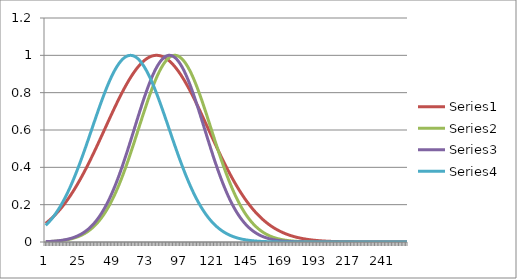
| Category | Series 1 | Series 2 | Series 3 | Series 4 |
|---|---|---|---|---|
| 0 | 0.1 | 0.002 | 0.002 | 0.089 |
| 1 | 0.106 | 0.002 | 0.002 | 0.097 |
| 2 | 0.112 | 0.002 | 0.003 | 0.105 |
| 3 | 0.119 | 0.003 | 0.003 | 0.113 |
| 4 | 0.126 | 0.003 | 0.003 | 0.122 |
| 5 | 0.133 | 0.004 | 0.004 | 0.131 |
| 6 | 0.14 | 0.004 | 0.005 | 0.141 |
| 7 | 0.148 | 0.005 | 0.005 | 0.152 |
| 8 | 0.156 | 0.005 | 0.006 | 0.163 |
| 9 | 0.165 | 0.006 | 0.007 | 0.174 |
| 10 | 0.173 | 0.007 | 0.008 | 0.187 |
| 11 | 0.182 | 0.007 | 0.009 | 0.199 |
| 12 | 0.192 | 0.008 | 0.01 | 0.213 |
| 13 | 0.201 | 0.01 | 0.011 | 0.227 |
| 14 | 0.211 | 0.011 | 0.012 | 0.241 |
| 15 | 0.222 | 0.012 | 0.014 | 0.257 |
| 16 | 0.232 | 0.013 | 0.016 | 0.272 |
| 17 | 0.244 | 0.015 | 0.018 | 0.289 |
| 18 | 0.255 | 0.017 | 0.02 | 0.306 |
| 19 | 0.267 | 0.019 | 0.022 | 0.323 |
| 20 | 0.279 | 0.021 | 0.025 | 0.341 |
| 21 | 0.291 | 0.023 | 0.028 | 0.36 |
| 22 | 0.304 | 0.026 | 0.031 | 0.379 |
| 23 | 0.317 | 0.029 | 0.034 | 0.399 |
| 24 | 0.33 | 0.032 | 0.038 | 0.419 |
| 25 | 0.343 | 0.035 | 0.042 | 0.439 |
| 26 | 0.357 | 0.039 | 0.046 | 0.46 |
| 27 | 0.371 | 0.043 | 0.051 | 0.481 |
| 28 | 0.386 | 0.048 | 0.056 | 0.503 |
| 29 | 0.401 | 0.052 | 0.062 | 0.524 |
| 30 | 0.415 | 0.058 | 0.068 | 0.546 |
| 31 | 0.431 | 0.063 | 0.075 | 0.568 |
| 32 | 0.446 | 0.069 | 0.082 | 0.59 |
| 33 | 0.462 | 0.075 | 0.09 | 0.613 |
| 34 | 0.477 | 0.082 | 0.098 | 0.635 |
| 35 | 0.493 | 0.09 | 0.107 | 0.657 |
| 36 | 0.51 | 0.098 | 0.116 | 0.679 |
| 37 | 0.526 | 0.106 | 0.126 | 0.701 |
| 38 | 0.542 | 0.115 | 0.137 | 0.722 |
| 39 | 0.559 | 0.125 | 0.148 | 0.743 |
| 40 | 0.575 | 0.135 | 0.16 | 0.764 |
| 41 | 0.592 | 0.146 | 0.172 | 0.784 |
| 42 | 0.608 | 0.157 | 0.186 | 0.804 |
| 43 | 0.625 | 0.17 | 0.2 | 0.823 |
| 44 | 0.641 | 0.182 | 0.215 | 0.842 |
| 45 | 0.658 | 0.196 | 0.23 | 0.859 |
| 46 | 0.674 | 0.21 | 0.246 | 0.876 |
| 47 | 0.691 | 0.225 | 0.263 | 0.892 |
| 48 | 0.707 | 0.24 | 0.281 | 0.907 |
| 49 | 0.723 | 0.256 | 0.299 | 0.922 |
| 50 | 0.739 | 0.273 | 0.318 | 0.935 |
| 51 | 0.754 | 0.29 | 0.338 | 0.947 |
| 52 | 0.77 | 0.308 | 0.359 | 0.958 |
| 53 | 0.785 | 0.327 | 0.379 | 0.967 |
| 54 | 0.799 | 0.346 | 0.401 | 0.976 |
| 55 | 0.814 | 0.366 | 0.423 | 0.983 |
| 56 | 0.828 | 0.387 | 0.446 | 0.989 |
| 57 | 0.842 | 0.408 | 0.469 | 0.994 |
| 58 | 0.855 | 0.429 | 0.492 | 0.997 |
| 59 | 0.868 | 0.451 | 0.516 | 0.999 |
| 60 | 0.88 | 0.474 | 0.54 | 1 |
| 61 | 0.892 | 0.496 | 0.564 | 0.999 |
| 62 | 0.904 | 0.519 | 0.588 | 0.997 |
| 63 | 0.914 | 0.543 | 0.613 | 0.994 |
| 64 | 0.925 | 0.566 | 0.637 | 0.99 |
| 65 | 0.934 | 0.59 | 0.661 | 0.984 |
| 66 | 0.944 | 0.613 | 0.685 | 0.976 |
| 67 | 0.952 | 0.637 | 0.709 | 0.968 |
| 68 | 0.96 | 0.66 | 0.733 | 0.958 |
| 69 | 0.967 | 0.684 | 0.756 | 0.948 |
| 70 | 0.974 | 0.707 | 0.778 | 0.936 |
| 71 | 0.979 | 0.729 | 0.8 | 0.923 |
| 72 | 0.985 | 0.752 | 0.821 | 0.909 |
| 73 | 0.989 | 0.774 | 0.842 | 0.893 |
| 74 | 0.993 | 0.795 | 0.861 | 0.878 |
| 75 | 0.996 | 0.815 | 0.879 | 0.861 |
| 76 | 0.998 | 0.835 | 0.897 | 0.843 |
| 77 | 0.999 | 0.854 | 0.913 | 0.825 |
| 78 | 1 | 0.873 | 0.928 | 0.806 |
| 79 | 1 | 0.89 | 0.942 | 0.786 |
| 80 | 0.999 | 0.906 | 0.954 | 0.766 |
| 81 | 0.998 | 0.921 | 0.965 | 0.745 |
| 82 | 0.995 | 0.935 | 0.975 | 0.724 |
| 83 | 0.992 | 0.948 | 0.983 | 0.702 |
| 84 | 0.989 | 0.959 | 0.99 | 0.681 |
| 85 | 0.984 | 0.969 | 0.995 | 0.659 |
| 86 | 0.979 | 0.978 | 0.998 | 0.636 |
| 87 | 0.973 | 0.985 | 1 | 0.614 |
| 88 | 0.967 | 0.991 | 1 | 0.592 |
| 89 | 0.96 | 0.996 | 0.999 | 0.57 |
| 90 | 0.952 | 0.999 | 0.995 | 0.548 |
| 91 | 0.943 | 1 | 0.991 | 0.526 |
| 92 | 0.934 | 1 | 0.985 | 0.504 |
| 93 | 0.924 | 0.998 | 0.977 | 0.483 |
| 94 | 0.914 | 0.995 | 0.968 | 0.462 |
| 95 | 0.903 | 0.99 | 0.957 | 0.441 |
| 96 | 0.892 | 0.984 | 0.945 | 0.42 |
| 97 | 0.88 | 0.977 | 0.931 | 0.4 |
| 98 | 0.867 | 0.968 | 0.916 | 0.381 |
| 99 | 0.854 | 0.958 | 0.9 | 0.361 |
| 100 | 0.841 | 0.946 | 0.883 | 0.343 |
| 101 | 0.827 | 0.933 | 0.865 | 0.325 |
| 102 | 0.813 | 0.919 | 0.846 | 0.307 |
| 103 | 0.799 | 0.904 | 0.826 | 0.29 |
| 104 | 0.784 | 0.887 | 0.805 | 0.274 |
| 105 | 0.769 | 0.87 | 0.783 | 0.258 |
| 106 | 0.753 | 0.851 | 0.761 | 0.243 |
| 107 | 0.738 | 0.832 | 0.738 | 0.228 |
| 108 | 0.722 | 0.812 | 0.714 | 0.214 |
| 109 | 0.706 | 0.791 | 0.691 | 0.2 |
| 110 | 0.69 | 0.77 | 0.666 | 0.188 |
| 111 | 0.674 | 0.748 | 0.642 | 0.175 |
| 112 | 0.657 | 0.726 | 0.618 | 0.164 |
| 113 | 0.641 | 0.703 | 0.593 | 0.153 |
| 114 | 0.624 | 0.68 | 0.569 | 0.142 |
| 115 | 0.607 | 0.656 | 0.545 | 0.132 |
| 116 | 0.591 | 0.633 | 0.521 | 0.123 |
| 117 | 0.574 | 0.609 | 0.497 | 0.114 |
| 118 | 0.558 | 0.586 | 0.474 | 0.105 |
| 119 | 0.541 | 0.562 | 0.45 | 0.097 |
| 120 | 0.525 | 0.539 | 0.428 | 0.09 |
| 121 | 0.509 | 0.516 | 0.406 | 0.083 |
| 122 | 0.493 | 0.493 | 0.384 | 0.076 |
| 123 | 0.477 | 0.47 | 0.363 | 0.07 |
| 124 | 0.461 | 0.448 | 0.342 | 0.064 |
| 125 | 0.445 | 0.426 | 0.323 | 0.059 |
| 126 | 0.43 | 0.404 | 0.303 | 0.054 |
| 127 | 0.415 | 0.384 | 0.285 | 0.049 |
| 128 | 0.4 | 0.363 | 0.267 | 0.045 |
| 129 | 0.385 | 0.343 | 0.25 | 0.041 |
| 130 | 0.371 | 0.324 | 0.234 | 0.038 |
| 131 | 0.357 | 0.305 | 0.218 | 0.034 |
| 132 | 0.343 | 0.287 | 0.203 | 0.031 |
| 133 | 0.329 | 0.27 | 0.189 | 0.028 |
| 134 | 0.316 | 0.253 | 0.175 | 0.026 |
| 135 | 0.303 | 0.237 | 0.162 | 0.023 |
| 136 | 0.29 | 0.222 | 0.15 | 0.021 |
| 137 | 0.278 | 0.207 | 0.139 | 0.019 |
| 138 | 0.266 | 0.193 | 0.128 | 0.017 |
| 139 | 0.254 | 0.18 | 0.118 | 0.015 |
| 140 | 0.243 | 0.167 | 0.108 | 0.014 |
| 141 | 0.232 | 0.156 | 0.1 | 0.012 |
| 142 | 0.221 | 0.144 | 0.091 | 0.011 |
| 143 | 0.211 | 0.133 | 0.083 | 0.01 |
| 144 | 0.201 | 0.123 | 0.076 | 0.009 |
| 145 | 0.191 | 0.114 | 0.07 | 0.008 |
| 146 | 0.182 | 0.105 | 0.063 | 0.007 |
| 147 | 0.173 | 0.096 | 0.058 | 0.006 |
| 148 | 0.164 | 0.089 | 0.052 | 0.006 |
| 149 | 0.156 | 0.081 | 0.047 | 0.005 |
| 150 | 0.148 | 0.074 | 0.043 | 0.004 |
| 151 | 0.14 | 0.068 | 0.039 | 0.004 |
| 152 | 0.133 | 0.062 | 0.035 | 0.003 |
| 153 | 0.125 | 0.057 | 0.031 | 0.003 |
| 154 | 0.119 | 0.052 | 0.028 | 0.003 |
| 155 | 0.112 | 0.047 | 0.025 | 0.002 |
| 156 | 0.106 | 0.043 | 0.023 | 0.002 |
| 157 | 0.1 | 0.039 | 0.02 | 0.002 |
| 158 | 0.094 | 0.035 | 0.018 | 0.002 |
| 159 | 0.089 | 0.031 | 0.016 | 0.001 |
| 160 | 0.083 | 0.028 | 0.014 | 0.001 |
| 161 | 0.078 | 0.026 | 0.013 | 0.001 |
| 162 | 0.074 | 0.023 | 0.011 | 0.001 |
| 163 | 0.069 | 0.021 | 0.01 | 0.001 |
| 164 | 0.065 | 0.019 | 0.009 | 0.001 |
| 165 | 0.061 | 0.017 | 0.008 | 0.001 |
| 166 | 0.057 | 0.015 | 0.007 | 0.001 |
| 167 | 0.053 | 0.013 | 0.006 | 0 |
| 168 | 0.05 | 0.012 | 0.005 | 0 |
| 169 | 0.047 | 0.01 | 0.005 | 0 |
| 170 | 0.044 | 0.009 | 0.004 | 0 |
| 171 | 0.041 | 0.008 | 0.004 | 0 |
| 172 | 0.038 | 0.007 | 0.003 | 0 |
| 173 | 0.035 | 0.006 | 0.003 | 0 |
| 174 | 0.033 | 0.006 | 0.002 | 0 |
| 175 | 0.031 | 0.005 | 0.002 | 0 |
| 176 | 0.029 | 0.004 | 0.002 | 0 |
| 177 | 0.027 | 0.004 | 0.002 | 0 |
| 178 | 0.025 | 0.003 | 0.001 | 0 |
| 179 | 0.023 | 0.003 | 0.001 | 0 |
| 180 | 0.021 | 0.003 | 0.001 | 0 |
| 181 | 0.02 | 0.002 | 0.001 | 0 |
| 182 | 0.018 | 0.002 | 0.001 | 0 |
| 183 | 0.017 | 0.002 | 0.001 | 0 |
| 184 | 0.016 | 0.002 | 0.001 | 0 |
| 185 | 0.014 | 0.001 | 0 | 0 |
| 186 | 0.013 | 0.001 | 0 | 0 |
| 187 | 0.012 | 0.001 | 0 | 0 |
| 188 | 0.011 | 0.001 | 0 | 0 |
| 189 | 0.01 | 0.001 | 0 | 0 |
| 190 | 0.01 | 0.001 | 0 | 0 |
| 191 | 0.009 | 0.001 | 0 | 0 |
| 192 | 0.008 | 0 | 0 | 0 |
| 193 | 0.007 | 0 | 0 | 0 |
| 194 | 0.007 | 0 | 0 | 0 |
| 195 | 0.006 | 0 | 0 | 0 |
| 196 | 0.006 | 0 | 0 | 0 |
| 197 | 0.005 | 0 | 0 | 0 |
| 198 | 0.005 | 0 | 0 | 0 |
| 199 | 0.004 | 0 | 0 | 0 |
| 200 | 0.004 | 0 | 0 | 0 |
| 201 | 0.004 | 0 | 0 | 0 |
| 202 | 0.003 | 0 | 0 | 0 |
| 203 | 0.003 | 0 | 0 | 0 |
| 204 | 0.003 | 0 | 0 | 0 |
| 205 | 0.003 | 0 | 0 | 0 |
| 206 | 0.002 | 0 | 0 | 0 |
| 207 | 0.002 | 0 | 0 | 0 |
| 208 | 0.002 | 0 | 0 | 0 |
| 209 | 0.002 | 0 | 0 | 0 |
| 210 | 0.002 | 0 | 0 | 0 |
| 211 | 0.001 | 0 | 0 | 0 |
| 212 | 0.001 | 0 | 0 | 0 |
| 213 | 0.001 | 0 | 0 | 0 |
| 214 | 0.001 | 0 | 0 | 0 |
| 215 | 0.001 | 0 | 0 | 0 |
| 216 | 0.001 | 0 | 0 | 0 |
| 217 | 0.001 | 0 | 0 | 0 |
| 218 | 0.001 | 0 | 0 | 0 |
| 219 | 0.001 | 0 | 0 | 0 |
| 220 | 0.001 | 0 | 0 | 0 |
| 221 | 0.001 | 0 | 0 | 0 |
| 222 | 0 | 0 | 0 | 0 |
| 223 | 0 | 0 | 0 | 0 |
| 224 | 0 | 0 | 0 | 0 |
| 225 | 0 | 0 | 0 | 0 |
| 226 | 0 | 0 | 0 | 0 |
| 227 | 0 | 0 | 0 | 0 |
| 228 | 0 | 0 | 0 | 0 |
| 229 | 0 | 0 | 0 | 0 |
| 230 | 0 | 0 | 0 | 0 |
| 231 | 0 | 0 | 0 | 0 |
| 232 | 0 | 0 | 0 | 0 |
| 233 | 0 | 0 | 0 | 0 |
| 234 | 0 | 0 | 0 | 0 |
| 235 | 0 | 0 | 0 | 0 |
| 236 | 0 | 0 | 0 | 0 |
| 237 | 0 | 0 | 0 | 0 |
| 238 | 0 | 0 | 0 | 0 |
| 239 | 0 | 0 | 0 | 0 |
| 240 | 0 | 0 | 0 | 0 |
| 241 | 0 | 0 | 0 | 0 |
| 242 | 0 | 0 | 0 | 0 |
| 243 | 0 | 0 | 0 | 0 |
| 244 | 0 | 0 | 0 | 0 |
| 245 | 0 | 0 | 0 | 0 |
| 246 | 0 | 0 | 0 | 0 |
| 247 | 0 | 0 | 0 | 0 |
| 248 | 0 | 0 | 0 | 0 |
| 249 | 0 | 0 | 0 | 0 |
| 250 | 0 | 0 | 0 | 0 |
| 251 | 0 | 0 | 0 | 0 |
| 252 | 0 | 0 | 0 | 0 |
| 253 | 0 | 0 | 0 | 0 |
| 254 | 0 | 0 | 0 | 0 |
| 255 | 0 | 0 | 0 | 0 |
| 256 | 0 | 0 | 0 | 0 |